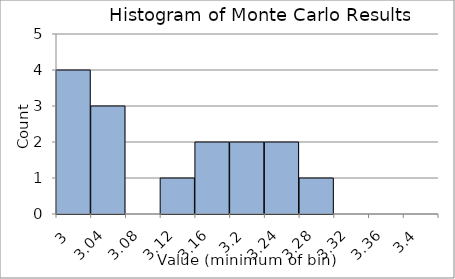
| Category | Series 0 |
|---|---|
| 3.0 | 4 |
| 3.04 | 3 |
| 3.08 | 0 |
| 3.12 | 1 |
| 3.16 | 2 |
| 3.2 | 2 |
| 3.24 | 2 |
| 3.2800000000000002 | 1 |
| 3.3200000000000003 | 0 |
| 3.3600000000000003 | 0 |
| 3.4000000000000004 | 0 |